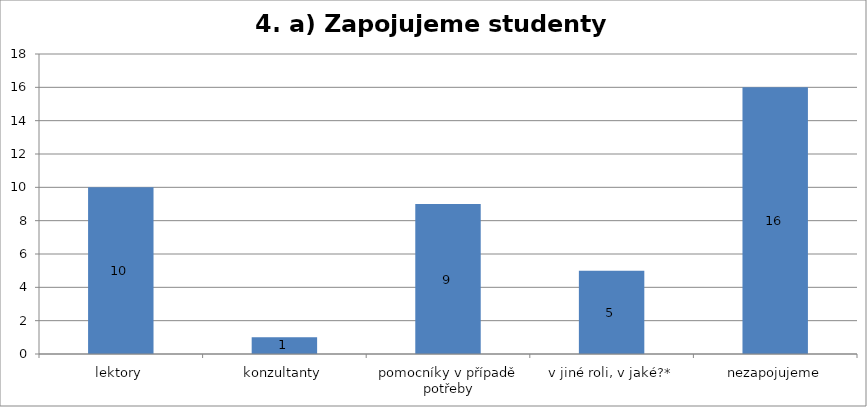
| Category | Series 0 |
|---|---|
| lektory | 10 |
| konzultanty | 1 |
| pomocníky v případě potřeby | 9 |
| v jiné roli, v jaké?* | 5 |
| nezapojujeme | 16 |